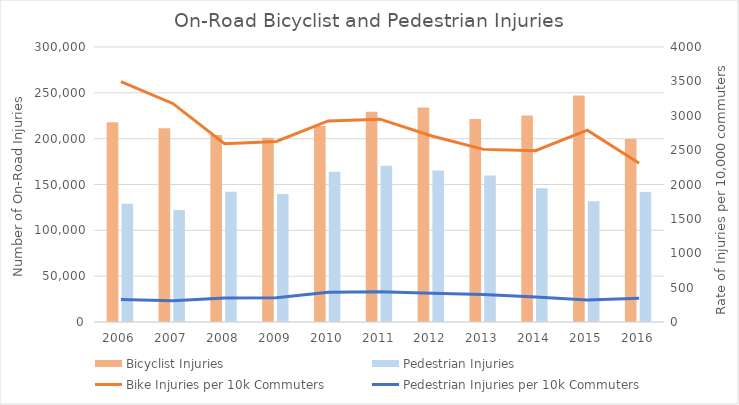
| Category | Bicyclist Injuries | Pedestrian Injuries |
|---|---|---|
| 2006.0 | 217898 | 128984 |
| 2007.0 | 211366 | 122076 |
| 2008.0 | 203889 | 142013 |
| 2009.0 | 201083 | 139714 |
| 2010.0 | 213905 | 163893 |
| 2011.0 | 229406 | 170408 |
| 2012.0 | 233931 | 165332 |
| 2013.0 | 221511 | 159890 |
| 2014.0 | 225338 | 145962 |
| 2015.0 | 246975 | 131863 |
| 2016.0 | 199544 | 141783 |